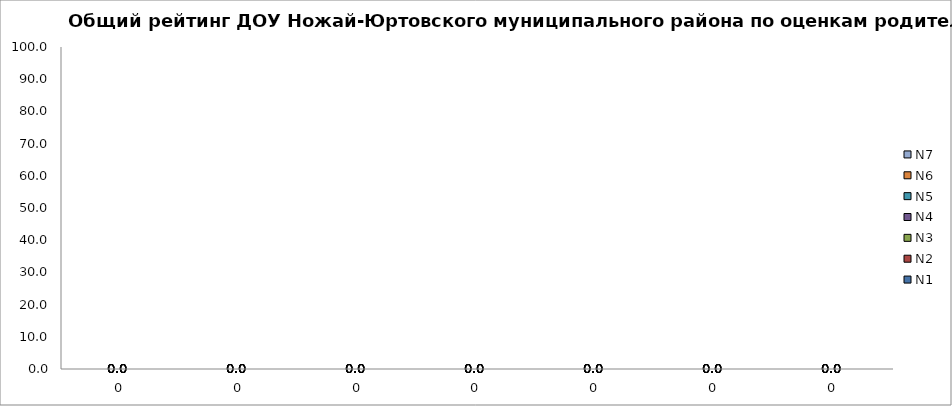
| Category | N1 | N2 | N3 | N4 | N5 | N6 | N7 |
|---|---|---|---|---|---|---|---|
| 0.0 | 0 | 0 | 0 | 0 | 0 | 0 | 0 |
| 0.0 | 0 | 0 | 0 | 0 | 0 | 0 | 0 |
| 0.0 | 0 | 0 | 0 | 0 | 0 | 0 | 0 |
| 0.0 | 0 | 0 | 0 | 0 | 0 | 0 | 0 |
| 0.0 | 0 | 0 | 0 | 0 | 0 | 0 | 0 |
| 0.0 | 0 | 0 | 0 | 0 | 0 | 0 | 0 |
| 0.0 | 0 | 0 | 0 | 0 | 0 | 0 | 0 |